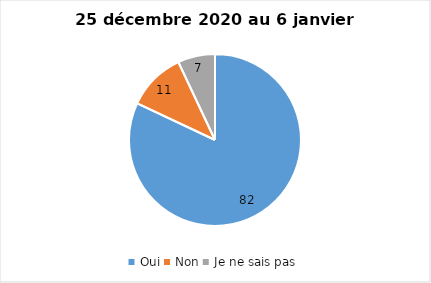
| Category | Series 0 |
|---|---|
| Oui | 82 |
| Non | 11 |
| Je ne sais pas | 7 |